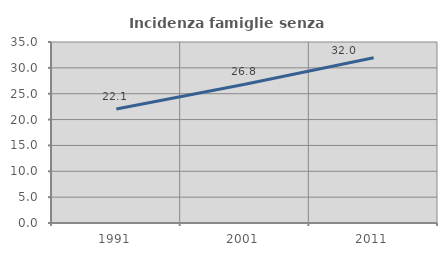
| Category | Incidenza famiglie senza nuclei |
|---|---|
| 1991.0 | 22.06 |
| 2001.0 | 26.819 |
| 2011.0 | 31.962 |